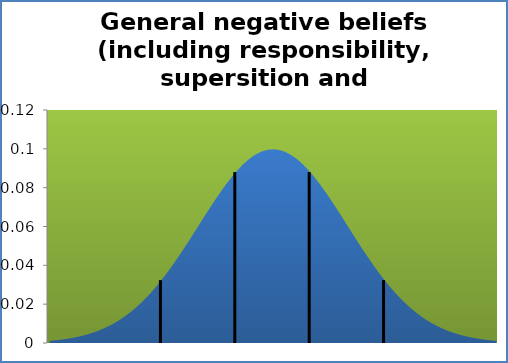
| Category | Series 1 |
|---|---|
| -2.6999999999999993 | 0.001 |
| -2.5 | 0.001 |
| -2.299999999999999 | 0.001 |
| -2.0999999999999996 | 0.002 |
| -1.8999999999999986 | 0.002 |
| -1.6999999999999993 | 0.002 |
| -1.5 | 0.003 |
| -1.299999999999999 | 0.003 |
| -1.0999999999999996 | 0.003 |
| -0.8999999999999986 | 0.004 |
| -0.6999999999999993 | 0.004 |
| -0.5 | 0.005 |
| -0.29999999999999893 | 0.006 |
| -0.09999999999999964 | 0.006 |
| 0.10000000000000142 | 0.007 |
| 0.3000000000000007 | 0.008 |
| 0.5 | 0.009 |
| 0.7000000000000011 | 0.01 |
| 0.9000000000000004 | 0.011 |
| 1.1000000000000014 | 0.012 |
| 1.3000000000000007 | 0.013 |
| 1.5000000000000009 | 0.015 |
| 1.700000000000001 | 0.016 |
| 1.9000000000000004 | 0.018 |
| 2.1000000000000005 | 0.02 |
| 2.3000000000000007 | 0.022 |
| 2.500000000000001 | 0.024 |
| 2.700000000000001 | 0.026 |
| 2.9000000000000004 | 0.028 |
| 3.1000000000000005 | 0.03 |
| 3.3000000000000007 | 0.032 |
| 3.500000000000001 | 0.035 |
| 3.700000000000001 | 0.037 |
| 3.9000000000000004 | 0.04 |
| 4.1000000000000005 | 0.043 |
| 4.300000000000001 | 0.046 |
| 4.500000000000001 | 0.049 |
| 4.700000000000001 | 0.051 |
| 4.9 | 0.054 |
| 5.1000000000000005 | 0.057 |
| 5.300000000000001 | 0.06 |
| 5.500000000000001 | 0.064 |
| 5.700000000000001 | 0.067 |
| 5.9 | 0.069 |
| 6.1000000000000005 | 0.072 |
| 6.300000000000001 | 0.075 |
| 6.500000000000001 | 0.078 |
| 6.700000000000001 | 0.081 |
| 6.9 | 0.083 |
| 7.1000000000000005 | 0.086 |
| 7.300000000000001 | 0.088 |
| 7.500000000000001 | 0.09 |
| 7.700000000000001 | 0.092 |
| 7.9 | 0.094 |
| 8.100000000000001 | 0.095 |
| 8.3 | 0.097 |
| 8.5 | 0.098 |
| 8.700000000000001 | 0.099 |
| 8.9 | 0.099 |
| 9.100000000000001 | 0.1 |
| 9.3 | 0.1 |
| 9.5 | 0.1 |
| 9.700000000000001 | 0.099 |
| 9.9 | 0.099 |
| 10.100000000000001 | 0.098 |
| 10.3 | 0.097 |
| 10.5 | 0.095 |
| 10.700000000000001 | 0.094 |
| 10.9 | 0.092 |
| 11.100000000000001 | 0.09 |
| 11.3 | 0.088 |
| 11.5 | 0.086 |
| 11.700000000000001 | 0.083 |
| 11.9 | 0.081 |
| 12.100000000000001 | 0.078 |
| 12.3 | 0.075 |
| 12.5 | 0.072 |
| 12.700000000000001 | 0.069 |
| 12.9 | 0.067 |
| 13.100000000000001 | 0.064 |
| 13.3 | 0.06 |
| 13.5 | 0.057 |
| 13.700000000000001 | 0.054 |
| 13.9 | 0.051 |
| 14.100000000000001 | 0.049 |
| 14.3 | 0.046 |
| 14.5 | 0.043 |
| 14.700000000000001 | 0.04 |
| 14.9 | 0.037 |
| 15.100000000000001 | 0.035 |
| 15.3 | 0.032 |
| 15.5 | 0.03 |
| 15.700000000000001 | 0.028 |
| 15.9 | 0.026 |
| 16.1 | 0.024 |
| 16.3 | 0.022 |
| 16.5 | 0.02 |
| 16.700000000000003 | 0.018 |
| 16.9 | 0.016 |
| 17.1 | 0.015 |
| 17.3 | 0.013 |
| 17.5 | 0.012 |
| 17.700000000000003 | 0.011 |
| 17.9 | 0.01 |
| 18.1 | 0.009 |
| 18.3 | 0.008 |
| 18.5 | 0.007 |
| 18.700000000000003 | 0.006 |
| 18.9 | 0.006 |
| 19.1 | 0.005 |
| 19.3 | 0.004 |
| 19.5 | 0.004 |
| 19.700000000000003 | 0.003 |
| 19.9 | 0.003 |
| 20.1 | 0.003 |
| 20.3 | 0.002 |
| 20.5 | 0.002 |
| 20.700000000000003 | 0.002 |
| 20.9 | 0.001 |
| 21.1 | 0.001 |
| 21.3 | 0.001 |